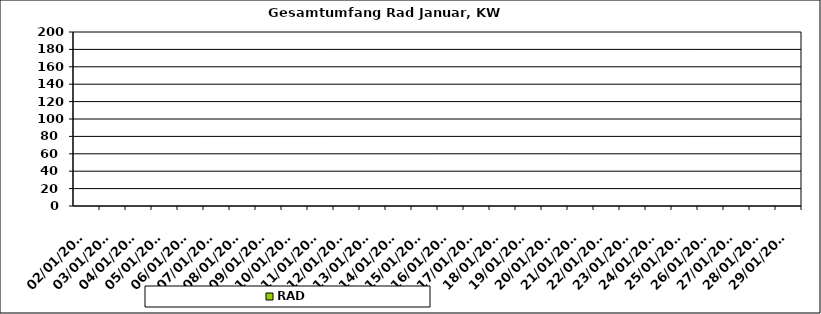
| Category | RAD |
|---|---|
| 02/01/2023 | 0 |
| 03/01/2023 | 0 |
| 04/01/2023 | 0 |
| 05/01/2023 | 0 |
| 06/01/2023 | 0 |
| 07/01/2023 | 0 |
| 08/01/2023 | 0 |
| 09/01/2023 | 0 |
| 10/01/2023 | 0 |
| 11/01/2023 | 0 |
| 12/01/2023 | 0 |
| 13/01/2023 | 0 |
| 14/01/2023 | 0 |
| 15/01/2023 | 0 |
| 16/01/2023 | 0 |
| 17/01/2023 | 0 |
| 18/01/2023 | 0 |
| 19/01/2023 | 0 |
| 20/01/2023 | 0 |
| 21/01/2023 | 0 |
| 22/01/2023 | 0 |
| 23/01/2023 | 0 |
| 24/01/2023 | 0 |
| 25/01/2023 | 0 |
| 26/01/2023 | 0 |
| 27/01/2023 | 0 |
| 28/01/2023 | 0 |
| 29/01/2023 | 0 |